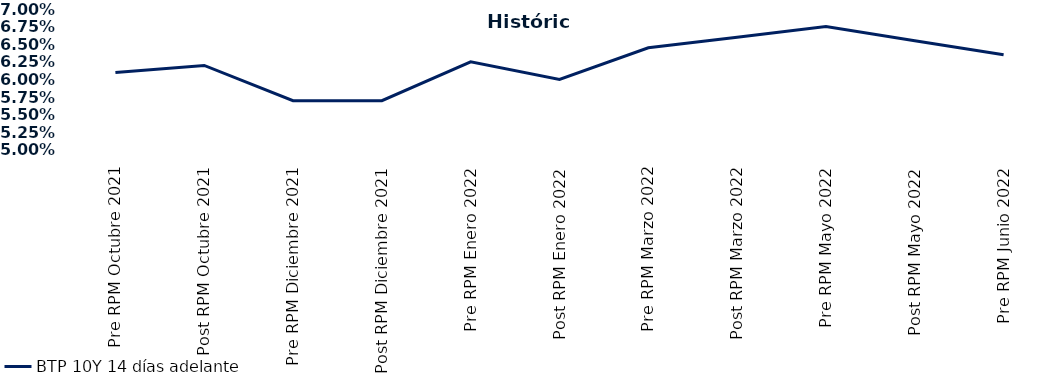
| Category | BTP 10Y 14 días adelante |
|---|---|
| Pre RPM Octubre 2021 | 0.061 |
| Post RPM Octubre 2021 | 0.062 |
| Pre RPM Diciembre 2021 | 0.057 |
| Post RPM Diciembre 2021 | 0.057 |
| Pre RPM Enero 2022 | 0.062 |
| Post RPM Enero 2022 | 0.06 |
| Pre RPM Marzo 2022 | 0.064 |
| Post RPM Marzo 2022 | 0.066 |
| Pre RPM Mayo 2022 | 0.068 |
| Post RPM Mayo 2022 | 0.066 |
| Pre RPM Junio 2022 | 0.064 |